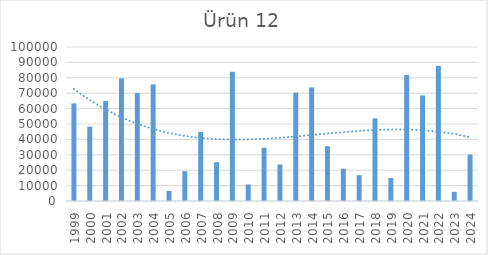
| Category | Ürün 12 |
|---|---|
| 1999.0 | 63429 |
| 2000.0 | 48267 |
| 2001.0 | 64901 |
| 2002.0 | 79667 |
| 2003.0 | 70196 |
| 2004.0 | 75737 |
| 2005.0 | 6492 |
| 2006.0 | 19370 |
| 2007.0 | 44842 |
| 2008.0 | 25180 |
| 2009.0 | 83943 |
| 2010.0 | 10730 |
| 2011.0 | 34581 |
| 2012.0 | 23756 |
| 2013.0 | 70414 |
| 2014.0 | 73792 |
| 2015.0 | 35567 |
| 2016.0 | 20969 |
| 2017.0 | 16720 |
| 2018.0 | 53661 |
| 2019.0 | 14969 |
| 2020.0 | 81805 |
| 2021.0 | 68558 |
| 2022.0 | 87904 |
| 2023.0 | 6002 |
| 2024.0 | 30199 |